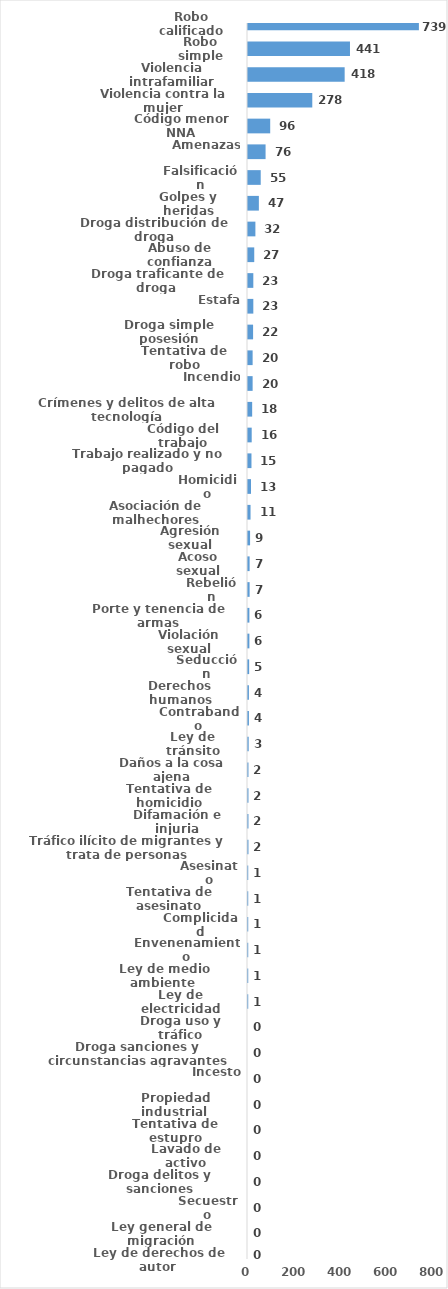
| Category | Series 0 |
|---|---|
| Robo calificado | 739 |
| Robo simple | 441 |
| Violencia intrafamiliar | 418 |
| Violencia contra la mujer | 278 |
| Código menor NNA | 96 |
| Amenazas | 76 |
| Falsificación | 55 |
| Golpes y heridas | 47 |
| Droga distribución de droga | 32 |
| Abuso de confianza | 27 |
| Droga traficante de droga  | 23 |
| Estafa | 23 |
| Droga simple posesión | 22 |
| Tentativa de robo | 20 |
| Incendio | 20 |
| Crímenes y delitos de alta tecnología | 18 |
| Código del trabajo | 16 |
| Trabajo realizado y no pagado | 15 |
| Homicidio | 13 |
| Asociación de malhechores | 11 |
| Agresión sexual | 9 |
| Acoso sexual | 7 |
| Rebelión | 7 |
| Porte y tenencia de armas | 6 |
| Violación sexual | 6 |
| Seducción | 5 |
| Derechos humanos | 4 |
| Contrabando | 4 |
| Ley de tránsito | 3 |
| Daños a la cosa ajena | 2 |
| Tentativa de homicidio | 2 |
| Difamación e injuria | 2 |
| Tráfico ilícito de migrantes y trata de personas | 2 |
| Asesinato | 1 |
| Tentativa de asesinato | 1 |
| Complicidad | 1 |
| Envenenamiento | 1 |
| Ley de medio ambiente  | 1 |
| Ley de electricidad | 1 |
| Droga uso y tráfico | 0 |
| Droga sanciones y circunstancias agravantes | 0 |
| Incesto | 0 |
| Propiedad industrial  | 0 |
| Tentativa de estupro | 0 |
| Lavado de activo | 0 |
| Droga delitos y sanciones | 0 |
| Secuestro | 0 |
| Ley general de migración | 0 |
| Ley de derechos de autor  | 0 |